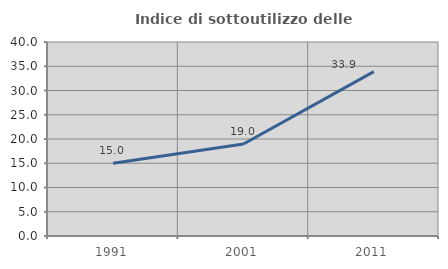
| Category | Indice di sottoutilizzo delle abitazioni  |
|---|---|
| 1991.0 | 14.989 |
| 2001.0 | 18.968 |
| 2011.0 | 33.903 |